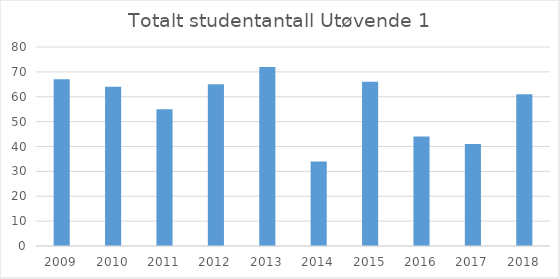
| Category | Series 0 |
|---|---|
| 2009.0 | 67 |
| 2010.0 | 64 |
| 2011.0 | 55 |
| 2012.0 | 65 |
| 2013.0 | 72 |
| 2014.0 | 34 |
| 2015.0 | 66 |
| 2016.0 | 44 |
| 2017.0 | 41 |
| 2018.0 | 61 |